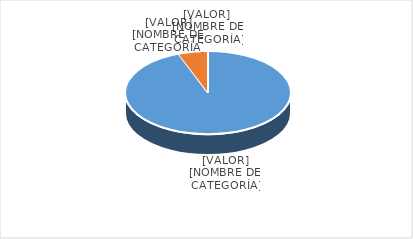
| Category | Series 0 |
|---|---|
| PRESUPUESTO VIGENTE PARA 2023 | 31000000 |
| PRESUPUESTO EJECUTADO  | 1900323.85 |
| PORCENTAJE DE EJECUCIÓN  | 0.061 |